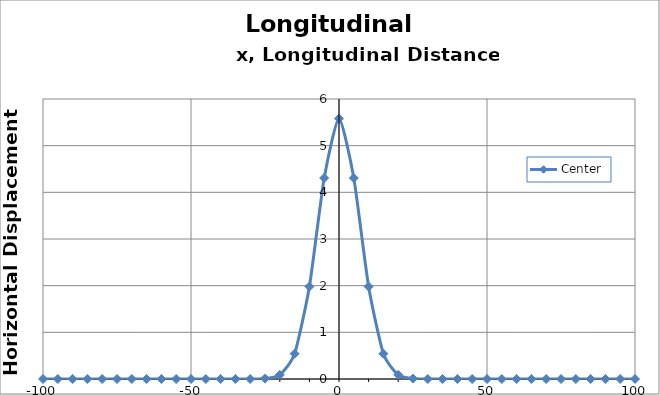
| Category | Center |
|---|---|
| -150.0 | 0 |
| -145.0 | 0 |
| -140.0 | 0 |
| -135.0 | 0 |
| -130.0 | 0 |
| -125.0 | 0 |
| -120.0 | 0 |
| -115.0 | 0 |
| -110.0 | 0 |
| -105.0 | 0 |
| -100.0 | 0 |
| -95.0 | 0 |
| -90.0 | 0 |
| -85.0 | 0 |
| -80.0 | 0 |
| -75.0 | 0 |
| -70.0 | 0 |
| -65.0 | 0 |
| -60.0 | 0 |
| -55.0 | 0 |
| -50.0 | 0 |
| -45.0 | 0 |
| -40.0 | 0 |
| -35.0 | 0 |
| -30.0 | 0 |
| -25.0 | 0.009 |
| -20.0 | 0.089 |
| -15.0 | 0.542 |
| -10.0 | 1.98 |
| -5.0 | 4.306 |
| 0.0 | 5.579 |
| 5.0 | 4.306 |
| 10.0 | 1.98 |
| 15.0 | 0.542 |
| 20.0 | 0.089 |
| 25.0 | 0.009 |
| 30.0 | 0 |
| 35.0 | 0 |
| 40.0 | 0 |
| 45.0 | 0 |
| 50.0 | 0 |
| 55.0 | 0 |
| 60.0 | 0 |
| 65.0 | 0 |
| 70.0 | 0 |
| 75.0 | 0 |
| 80.0 | 0 |
| 85.0 | 0 |
| 90.0 | 0 |
| 95.0 | 0 |
| 100.0 | 0 |
| 105.0 | 0 |
| 110.0 | 0 |
| 115.0 | 0 |
| 120.0 | 0 |
| 125.0 | 0 |
| 130.0 | 0 |
| 135.0 | 0 |
| 140.0 | 0 |
| 145.0 | 0 |
| 150.0 | 0 |